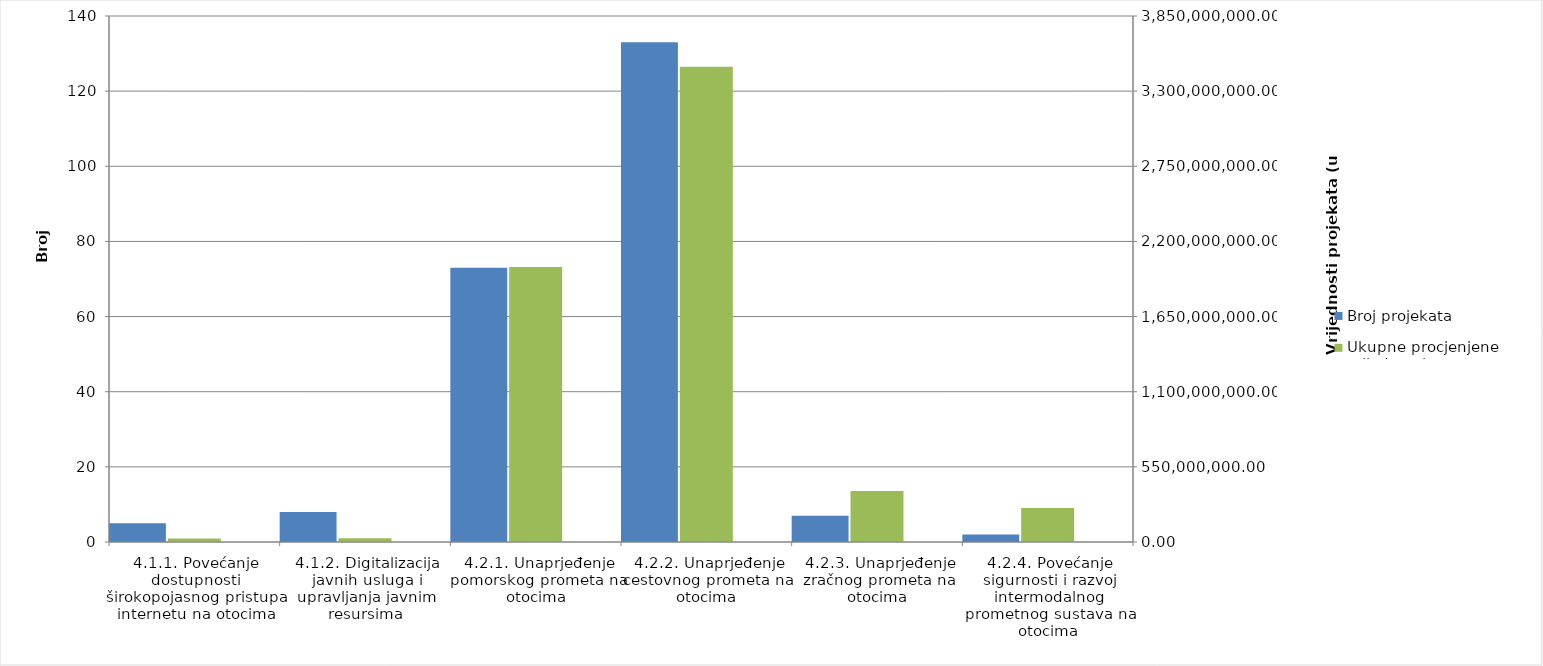
| Category | Broj projekata | Series 1 |
|---|---|---|
| 4.1.1. Povećanje dostupnosti širokopojasnog pristupa internetu na otocima | 5 |  |
| 4.1.2. Digitalizacija javnih usluga i upravljanja javnim resursima | 8 |  |
| 4.2.1. Unaprjeđenje pomorskog prometa na otocima | 73 |  |
| 4.2.2. Unaprjeđenje cestovnog prometa na otocima | 133 |  |
| 4.2.3. Unaprjeđenje zračnog prometa na otocima | 7 |  |
| 4.2.4. Povećanje sigurnosti i razvoj intermodalnog prometnog sustava na otocima | 2 |  |